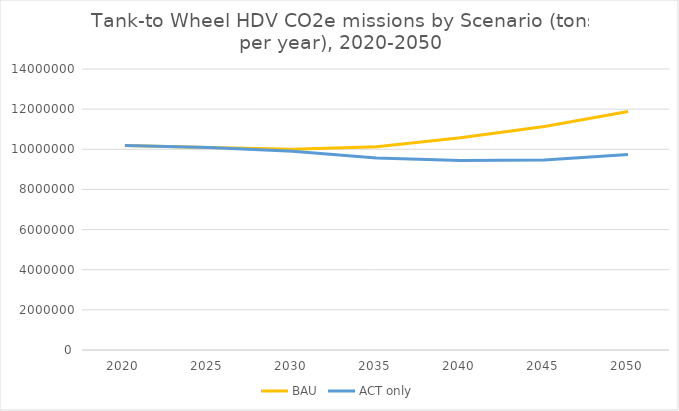
| Category | BAU | ACT only |
|---|---|---|
| 2020.0 | 10182765.643 | 10182765.643 |
| 2025.0 | 10084542.796 | 10084542.796 |
| 2030.0 | 10007152.732 | 9900976.106 |
| 2035.0 | 10132305.259 | 9570570.041 |
| 2040.0 | 10574792.146 | 9447467.111 |
| 2045.0 | 11135375.442 | 9470024.013 |
| 2050.0 | 11880097.935 | 9745335.323 |